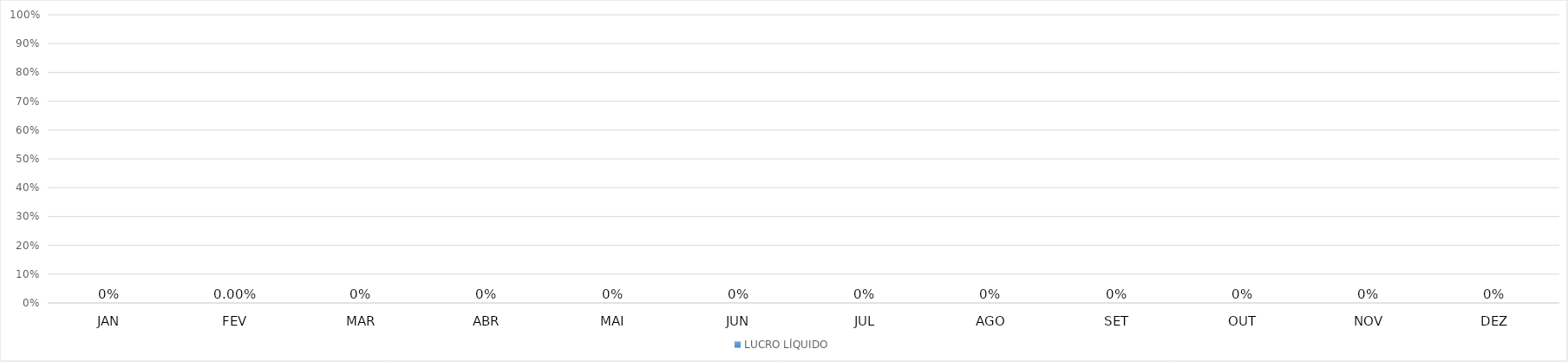
| Category | LUCRO LÍQUIDO |
|---|---|
| JAN | 0 |
| FEV | 0 |
| MAR | 0 |
| ABR | 0 |
| MAI | 0 |
| JUN | 0 |
| JUL | 0 |
| AGO | 0 |
| SET | 0 |
| OUT | 0 |
| NOV | 0 |
| DEZ | 0 |